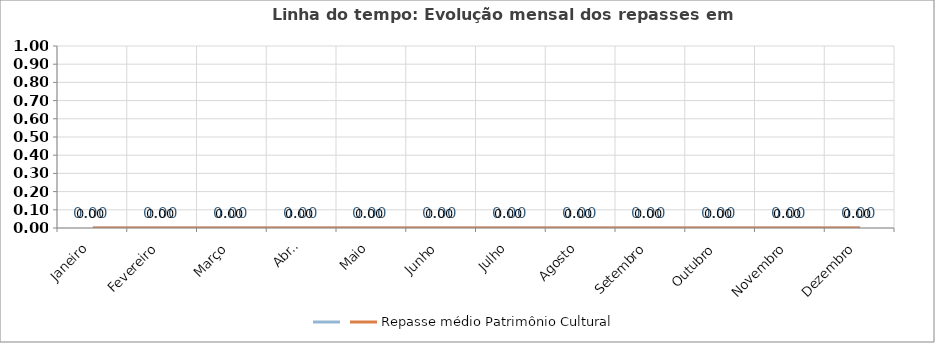
| Category | Series 0 | Repasse médio Patrimônio Cultural |
|---|---|---|
| Janeiro | 0 | 0 |
| Fevereiro | 0 | 0 |
| Março | 0 | 0 |
| Abril | 0 | 0 |
| Maio | 0 | 0 |
| Junho | 0 | 0 |
| Julho | 0 | 0 |
| Agosto | 0 | 0 |
| Setembro | 0 | 0 |
| Outubro | 0 | 0 |
| Novembro | 0 | 0 |
| Dezembro | 0 | 0 |